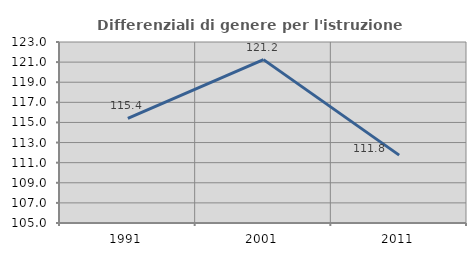
| Category | Differenziali di genere per l'istruzione superiore |
|---|---|
| 1991.0 | 115.401 |
| 2001.0 | 121.249 |
| 2011.0 | 111.752 |